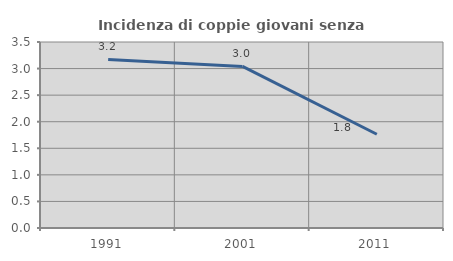
| Category | Incidenza di coppie giovani senza figli |
|---|---|
| 1991.0 | 3.173 |
| 2001.0 | 3.041 |
| 2011.0 | 1.764 |